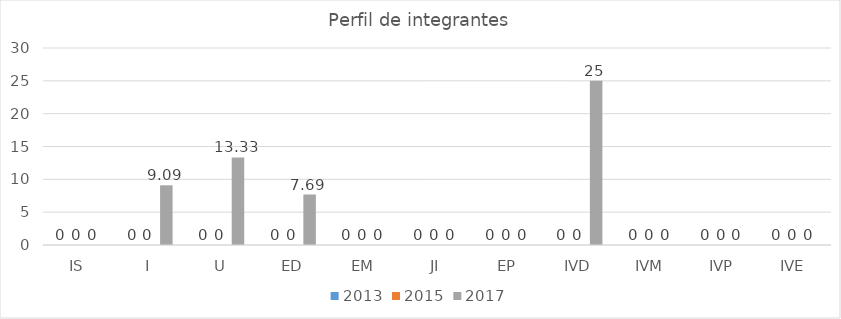
| Category | 2013 | 2015 | 2017 |
|---|---|---|---|
| IS | 0 | 0 | 0 |
| I | 0 | 0 | 9.09 |
| U | 0 | 0 | 13.33 |
| ED | 0 | 0 | 7.69 |
| EM | 0 | 0 | 0 |
| JI | 0 | 0 | 0 |
| EP | 0 | 0 | 0 |
| IVD | 0 | 0 | 25 |
| IVM | 0 | 0 | 0 |
| IVP | 0 | 0 | 0 |
| IVE | 0 | 0 | 0 |